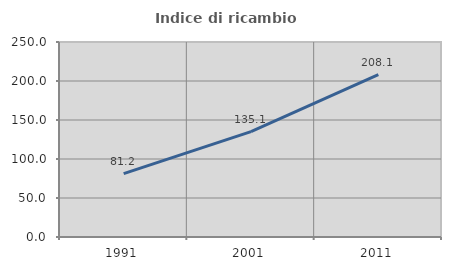
| Category | Indice di ricambio occupazionale  |
|---|---|
| 1991.0 | 81.188 |
| 2001.0 | 135.099 |
| 2011.0 | 208.092 |